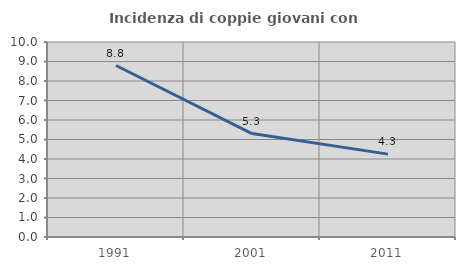
| Category | Incidenza di coppie giovani con figli |
|---|---|
| 1991.0 | 8.795 |
| 2001.0 | 5.305 |
| 2011.0 | 4.251 |